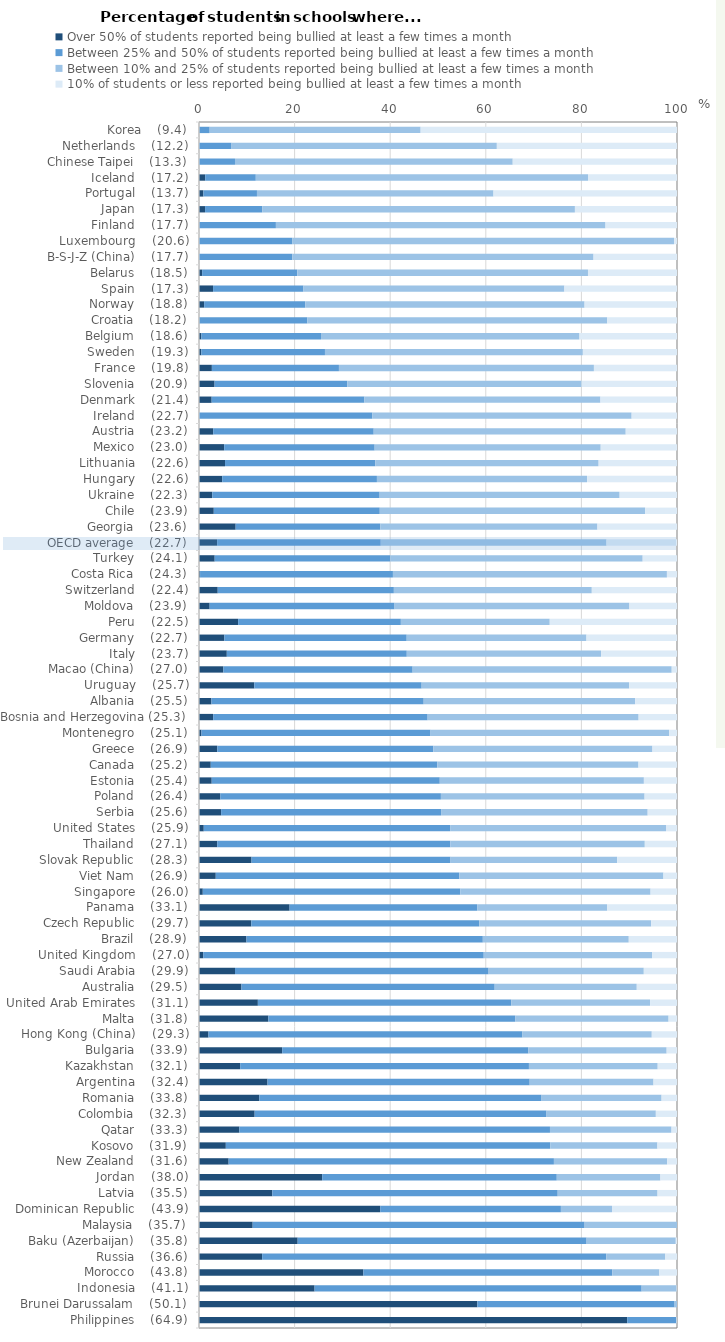
| Category | Over 50% of students reported being bullied at least a few times a month | Between 25% and 50% of students reported being bullied at least a few times a month | Between 10% and 25% of students reported being bullied at least a few times a month | 10% of students or less reported being bullied at least a few times a month |
|---|---|---|---|---|
| Philippines    (64.9) | 89.585 | 10.297 | 0 | 0.119 |
| Brunei Darussalam    (50.1) | 58.239 | 41.136 | 0.625 | 0 |
| Indonesia    (41.1) | 24.183 | 68.422 | 7.31 | 0.084 |
| Morocco    (43.8) | 34.393 | 52.062 | 9.858 | 3.687 |
| Russia    (36.6) | 13.212 | 71.999 | 12.334 | 2.455 |
| Baku (Azerbaijan)    (35.8) | 20.644 | 60.444 | 18.656 | 0.255 |
| Malaysia    (35.7) | 11.231 | 69.442 | 19.327 | 0 |
| Dominican Republic    (43.9) | 37.912 | 37.8 | 10.687 | 13.601 |
| Latvia    (35.5) | 15.336 | 59.708 | 20.886 | 4.07 |
| Jordan    (38.0) | 25.768 | 49.083 | 21.675 | 3.474 |
| New Zealand    (31.6) | 6.201 | 68.051 | 23.7 | 2.048 |
| Kosovo    (31.9) | 5.612 | 67.873 | 22.419 | 4.096 |
| Qatar    (33.3) | 8.45 | 64.975 | 25.429 | 1.147 |
| Colombia    (32.3) | 11.645 | 61.061 | 22.865 | 4.429 |
| Romania    (33.8) | 12.629 | 59.035 | 25.112 | 3.224 |
| Argentina    (32.4) | 14.342 | 54.842 | 25.902 | 4.914 |
| Kazakhstan    (32.1) | 8.619 | 60.405 | 26.936 | 4.04 |
| Bulgaria    (33.9) | 17.406 | 51.51 | 28.92 | 2.164 |
| Hong Kong (China)    (29.3) | 1.983 | 65.684 | 27.056 | 5.278 |
| Malta    (31.8) | 14.515 | 51.681 | 32.044 | 1.76 |
| United Arab Emirates    (31.1) | 12.316 | 53.036 | 29.011 | 5.637 |
| Australia    (29.5) | 8.881 | 52.98 | 29.721 | 8.418 |
| Saudi Arabia    (29.9) | 7.534 | 53.055 | 32.464 | 6.948 |
| United Kingdom    (27.0) | 0.882 | 58.687 | 35.251 | 5.18 |
| Brazil    (28.9) | 9.934 | 49.442 | 30.532 | 10.092 |
| Czech Republic    (29.7) | 10.94 | 47.702 | 35.963 | 5.396 |
| Panama    (33.1) | 18.955 | 39.233 | 27.195 | 14.618 |
| Singapore    (26.0) | 0.794 | 53.882 | 39.795 | 5.53 |
| Viet Nam    (26.9) | 3.509 | 50.954 | 42.701 | 2.836 |
| Slovak Republic    (28.3) | 10.994 | 41.628 | 34.863 | 12.514 |
| Thailand    (27.1) | 3.811 | 48.77 | 40.68 | 6.739 |
| United States    (25.9) | 0.996 | 51.544 | 45.166 | 2.295 |
| Serbia    (25.6) | 4.63 | 46.018 | 43.216 | 6.136 |
| Poland    (26.4) | 4.446 | 46.162 | 42.613 | 6.779 |
| Estonia    (25.4) | 2.661 | 47.711 | 42.7 | 6.928 |
| Canada    (25.2) | 2.46 | 47.387 | 42.095 | 8.057 |
| Greece    (26.9) | 3.825 | 45.198 | 45.842 | 5.134 |
| Montenegro    (25.1) | 0.513 | 47.931 | 49.933 | 1.624 |
| Bosnia and Herzegovina (25.3) | 2.975 | 44.86 | 44.133 | 8.032 |
| Albania    (25.5) | 2.598 | 44.41 | 44.248 | 8.744 |
| Uruguay    (25.7) | 11.575 | 35.004 | 43.421 | 10 |
| Macao (China)    (27.0) | 5.098 | 39.599 | 54.198 | 1.106 |
| Italy    (23.7) | 5.82 | 37.651 | 40.652 | 15.877 |
| Germany    (22.7) | 5.312 | 38.144 | 37.612 | 18.932 |
| Peru    (22.5) | 8.188 | 34.044 | 31.146 | 26.622 |
| Moldova    (23.9) | 2.23 | 38.686 | 49.127 | 9.958 |
| Switzerland    (22.4) | 3.918 | 36.849 | 41.407 | 17.825 |
| Costa Rica    (24.3) | 0.221 | 40.35 | 57.317 | 2.111 |
| Turkey    (24.1) | 3.284 | 36.725 | 52.81 | 7.181 |
| OECD average    (22.7) | 3.791 | 34.238 | 47.23 | 14.741 |
| Georgia    (23.6) | 7.671 | 30.26 | 45.426 | 16.644 |
| Chile    (23.9) | 3.096 | 34.724 | 55.524 | 6.656 |
| Ukraine    (22.3) | 2.777 | 35.015 | 50.205 | 12.002 |
| Hungary    (22.6) | 4.856 | 32.368 | 43.96 | 18.816 |
| Lithuania    (22.6) | 5.446 | 31.426 | 46.731 | 16.397 |
| Mexico    (23.0) | 5.271 | 31.477 | 47.292 | 15.96 |
| Austria    (23.2) | 2.971 | 33.582 | 52.721 | 10.726 |
| Ireland    (22.7) | 0 | 36.282 | 54.227 | 9.491 |
| Denmark    (21.4) | 2.651 | 31.957 | 49.379 | 16.012 |
| Slovenia    (20.9) | 3.261 | 27.78 | 49.011 | 19.948 |
| France    (19.8) | 2.695 | 26.582 | 53.343 | 17.38 |
| Sweden    (19.3) | 0.484 | 25.869 | 53.955 | 19.692 |
| Belgium    (18.6) | 0.496 | 25.033 | 54.07 | 20.402 |
| Croatia    (18.2) | 0.07 | 22.606 | 62.733 | 14.592 |
| Norway    (18.8) | 1.076 | 21.144 | 58.444 | 19.336 |
| Spain    (17.3) | 2.946 | 18.903 | 54.59 | 23.56 |
| Belarus    (18.5) | 0.658 | 19.912 | 60.806 | 18.625 |
| B-S-J-Z (China)    (17.7) | 0 | 19.534 | 63.005 | 17.461 |
| Luxembourg    (20.6) | 0 | 19.484 | 79.921 | 0.595 |
| Finland    (17.7) | 0.063 | 16.025 | 68.956 | 14.956 |
| Japan    (17.3) | 1.271 | 11.973 | 65.4 | 21.357 |
| Portugal    (13.7) | 0.914 | 11.212 | 49.486 | 38.388 |
| Iceland    (17.2) | 1.302 | 10.582 | 69.498 | 18.618 |
| Chinese Taipei    (13.3) | 0 | 7.529 | 58.107 | 34.364 |
| Netherlands    (12.2) | 0 | 6.807 | 55.504 | 37.689 |
| Korea    (9.4) | 0.069 | 2.166 | 44.132 | 53.633 |